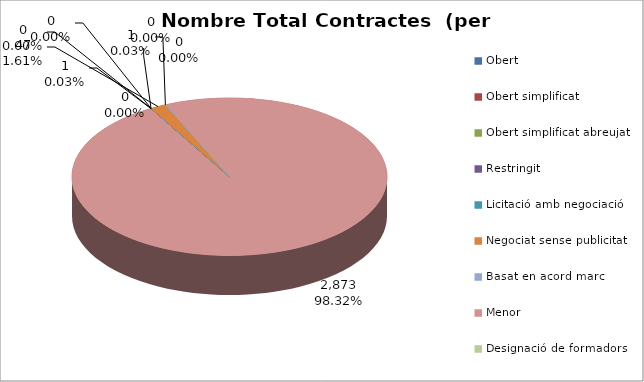
| Category | Nombre Total Contractes |
|---|---|
| Obert | 1 |
| Obert simplificat | 0 |
| Obert simplificat abreujat | 0 |
| Restringit | 0 |
| Licitació amb negociació | 0 |
| Negociat sense publicitat | 47 |
| Basat en acord marc | 1 |
| Menor | 2873 |
| Designació de formadors | 0 |